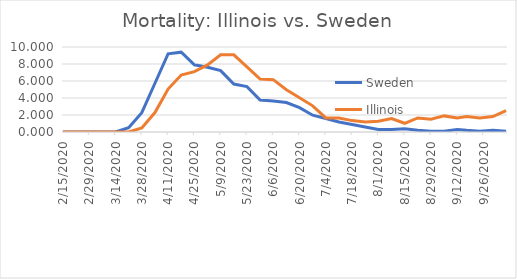
| Category | Sweden | Illinois |
|---|---|---|
| 2/15/20 | 0 | 0 |
| 2/22/20 | 0 | 0 |
| 2/29/20 | 0 | 0 |
| 3/7/20 | 0 | 0 |
| 3/14/20 | 0 | 0 |
| 3/21/20 | 0.494 | 0 |
| 3/28/20 | 2.274 | 0.473 |
| 4/4/20 | 5.735 | 2.289 |
| 4/11/20 | 9.196 | 5.051 |
| 4/18/20 | 9.394 | 6.708 |
| 4/25/20 | 7.911 | 7.102 |
| 5/2/20 | 7.614 | 7.891 |
| 5/9/20 | 7.218 | 9.075 |
| 5/16/20 | 5.636 | 9.075 |
| 5/23/20 | 5.34 | 7.655 |
| 5/30/20 | 3.758 | 6.234 |
| 6/6/20 | 3.659 | 6.155 |
| 6/13/20 | 3.461 | 4.972 |
| 6/20/20 | 2.868 | 4.025 |
| 6/27/20 | 1.978 | 3.078 |
| 7/4/20 | 1.582 | 1.657 |
| 7/11/20 | 1.187 | 1.657 |
| 7/18/20 | 0.89 | 1.342 |
| 7/25/20 | 0.593 | 1.184 |
| 8/1/20 | 0.297 | 1.263 |
| 8/8/20 | 0.297 | 1.578 |
| 8/15/20 | 0.396 | 1.026 |
| 8/22/20 | 0.198 | 1.657 |
| 8/29/20 | 0.099 | 1.499 |
| 9/5/20 | 0.099 | 1.894 |
| 9/12/20 | 0.297 | 1.657 |
| 9/17/20 | 0.198 | 1.815 |
| 9/24/20 | 0.099 | 1.657 |
| 10/1/20 | 0.198 | 1.815 |
| 10/8/20 | 0.099 | 2.525 |